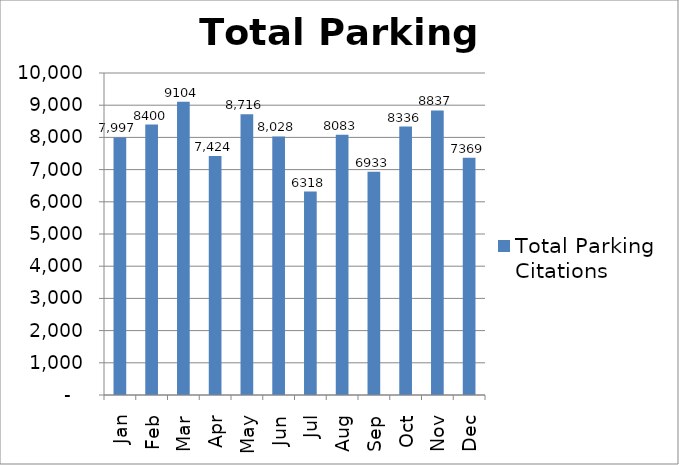
| Category | Total Parking Citations |
|---|---|
| Jan | 7997 |
| Feb | 8400 |
| Mar | 9104 |
| Apr | 7424 |
| May | 8716 |
| Jun | 8028 |
| Jul | 6318 |
| Aug | 8083 |
| Sep | 6933 |
| Oct | 8336 |
| Nov | 8837 |
| Dec | 7369 |